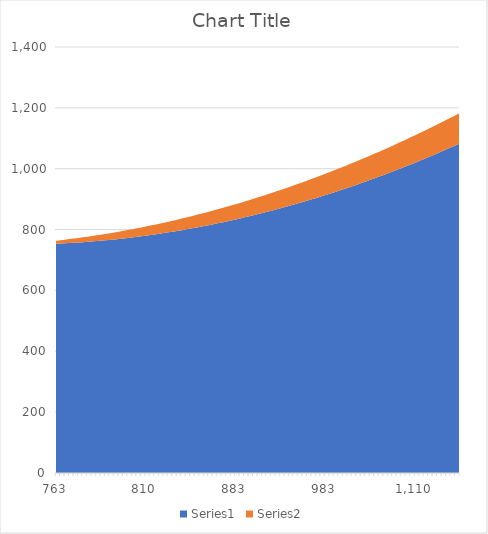
| Category | Series 0 | Series 1 |
|---|---|---|
| 763.3333333333334 | 753.333 | 10 |
| 765.0333333333333 | 754.033 | 11 |
| 766.8 | 754.8 | 12 |
| 768.6333333333333 | 755.633 | 13 |
| 770.5333333333333 | 756.533 | 14 |
| 772.5 | 757.5 | 15 |
| 774.5333333333333 | 758.533 | 16 |
| 776.6333333333333 | 759.633 | 17 |
| 778.8 | 760.8 | 18 |
| 781.0333333333333 | 762.033 | 19 |
| 783.3333333333334 | 763.333 | 20 |
| 785.7 | 764.7 | 21 |
| 788.1333333333333 | 766.133 | 22 |
| 790.6333333333333 | 767.633 | 23 |
| 793.2 | 769.2 | 24 |
| 795.8333333333334 | 770.833 | 25 |
| 798.5333333333333 | 772.533 | 26 |
| 801.3 | 774.3 | 27 |
| 804.1333333333333 | 776.133 | 28 |
| 807.0333333333333 | 778.033 | 29 |
| 810.0 | 780 | 30 |
| 813.0333333333333 | 782.033 | 31 |
| 816.1333333333333 | 784.133 | 32 |
| 819.3 | 786.3 | 33 |
| 822.5333333333333 | 788.533 | 34 |
| 825.8333333333334 | 790.833 | 35 |
| 829.2 | 793.2 | 36 |
| 832.6333333333333 | 795.633 | 37 |
| 836.1333333333333 | 798.133 | 38 |
| 839.7 | 800.7 | 39 |
| 843.3333333333334 | 803.333 | 40 |
| 847.0333333333333 | 806.033 | 41 |
| 850.8 | 808.8 | 42 |
| 854.6333333333333 | 811.633 | 43 |
| 858.5333333333333 | 814.533 | 44 |
| 862.5 | 817.5 | 45 |
| 866.5333333333333 | 820.533 | 46 |
| 870.6333333333333 | 823.633 | 47 |
| 874.8 | 826.8 | 48 |
| 879.0333333333333 | 830.033 | 49 |
| 883.3333333333334 | 833.333 | 50 |
| 887.7 | 836.7 | 51 |
| 892.1333333333333 | 840.133 | 52 |
| 896.6333333333333 | 843.633 | 53 |
| 901.2 | 847.2 | 54 |
| 905.8333333333334 | 850.833 | 55 |
| 910.5333333333333 | 854.533 | 56 |
| 915.3 | 858.3 | 57 |
| 920.1333333333333 | 862.133 | 58 |
| 925.0333333333333 | 866.033 | 59 |
| 930.0 | 870 | 60 |
| 935.0333333333333 | 874.033 | 61 |
| 940.1333333333333 | 878.133 | 62 |
| 945.3 | 882.3 | 63 |
| 950.5333333333333 | 886.533 | 64 |
| 955.8333333333334 | 890.833 | 65 |
| 961.2 | 895.2 | 66 |
| 966.6333333333333 | 899.633 | 67 |
| 972.1333333333333 | 904.133 | 68 |
| 977.7 | 908.7 | 69 |
| 983.3333333333334 | 913.333 | 70 |
| 989.0333333333333 | 918.033 | 71 |
| 994.8 | 922.8 | 72 |
| 1000.6333333333333 | 927.633 | 73 |
| 1006.5333333333333 | 932.533 | 74 |
| 1012.5 | 937.5 | 75 |
| 1018.5333333333333 | 942.533 | 76 |
| 1024.6333333333332 | 947.633 | 77 |
| 1030.8 | 952.8 | 78 |
| 1037.0333333333333 | 958.033 | 79 |
| 1043.3333333333335 | 963.333 | 80 |
| 1049.7 | 968.7 | 81 |
| 1056.1333333333332 | 974.133 | 82 |
| 1062.6333333333332 | 979.633 | 83 |
| 1069.2 | 985.2 | 84 |
| 1075.8333333333335 | 990.833 | 85 |
| 1082.5333333333333 | 996.533 | 86 |
| 1089.3 | 1002.3 | 87 |
| 1096.1333333333332 | 1008.133 | 88 |
| 1103.0333333333333 | 1014.033 | 89 |
| 1110.0 | 1020 | 90 |
| 1117.0333333333333 | 1026.033 | 91 |
| 1124.1333333333332 | 1032.133 | 92 |
| 1131.3 | 1038.3 | 93 |
| 1138.5333333333333 | 1044.533 | 94 |
| 1145.8333333333333 | 1050.833 | 95 |
| 1153.2 | 1057.2 | 96 |
| 1160.6333333333332 | 1063.633 | 97 |
| 1168.1333333333332 | 1070.133 | 98 |
| 1175.7 | 1076.7 | 99 |
| 1183.3333333333333 | 1083.333 | 100 |